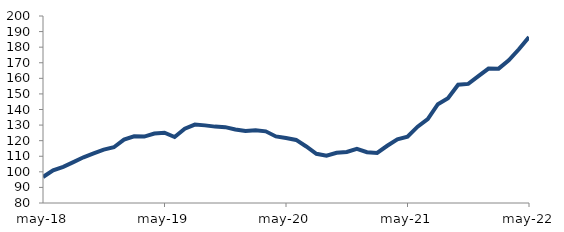
| Category | Series 0 |
|---|---|
| 2018-05-01 | 96.708 |
| 2018-06-01 | 100.939 |
| 2018-07-01 | 103.223 |
| 2018-08-01 | 106.194 |
| 2018-09-01 | 109.327 |
| 2018-10-01 | 111.815 |
| 2018-11-01 | 114.242 |
| 2018-12-01 | 115.778 |
| 2019-01-01 | 120.689 |
| 2019-02-01 | 122.792 |
| 2019-03-01 | 122.605 |
| 2019-04-01 | 124.541 |
| 2019-05-01 | 125.115 |
| 2019-06-01 | 122.365 |
| 2019-07-01 | 127.653 |
| 2019-08-01 | 130.323 |
| 2019-09-01 | 129.814 |
| 2019-10-01 | 129.013 |
| 2019-11-01 | 128.663 |
| 2019-12-01 | 127.192 |
| 2020-01-01 | 126.144 |
| 2020-02-01 | 126.638 |
| 2020-03-01 | 125.992 |
| 2020-04-01 | 122.726 |
| 2020-05-01 | 121.669 |
| 2020-06-01 | 120.485 |
| 2020-07-01 | 116.268 |
| 2020-08-01 | 111.597 |
| 2020-09-01 | 110.39 |
| 2020-10-01 | 112.229 |
| 2020-11-01 | 112.769 |
| 2020-12-01 | 114.741 |
| 2021-01-01 | 112.625 |
| 2021-02-01 | 112.14 |
| 2021-03-01 | 116.74 |
| 2021-04-01 | 120.911 |
| 2021-05-01 | 122.536 |
| 2021-06-01 | 128.968 |
| 2021-07-01 | 133.864 |
| 2021-08-01 | 143.384 |
| 2021-09-01 | 147.196 |
| 2021-10-01 | 155.883 |
| 2021-11-01 | 156.426 |
| 2021-12-01 | 161.4 |
| 2022-01-01 | 166.276 |
| 2022-02-01 | 166.219 |
| 2022-03-01 | 171.531 |
| 2022-04-01 | 178.644 |
| 2022-05-01 | 186.465 |